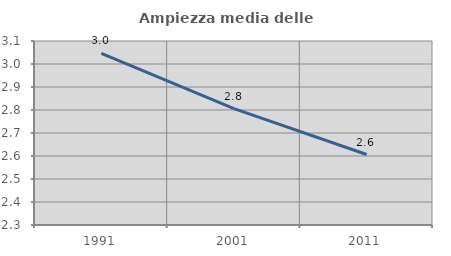
| Category | Ampiezza media delle famiglie |
|---|---|
| 1991.0 | 3.046 |
| 2001.0 | 2.806 |
| 2011.0 | 2.606 |